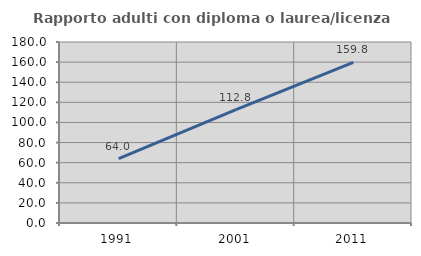
| Category | Rapporto adulti con diploma o laurea/licenza media  |
|---|---|
| 1991.0 | 63.973 |
| 2001.0 | 112.811 |
| 2011.0 | 159.756 |